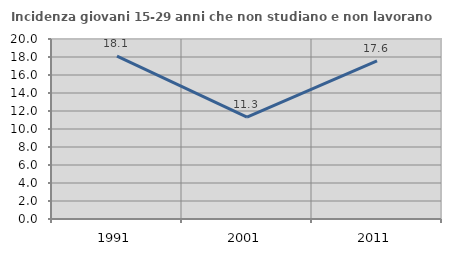
| Category | Incidenza giovani 15-29 anni che non studiano e non lavorano  |
|---|---|
| 1991.0 | 18.09 |
| 2001.0 | 11.331 |
| 2011.0 | 17.562 |